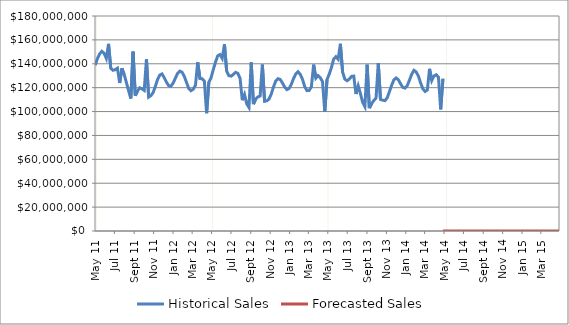
| Category | Week 1 of each Year |
|---|---|
| 2011-05-20 | 1 |
| 2011-05-27 | 0 |
| 2011-06-03 | 0 |
| 2011-06-10 | 0 |
| 2011-06-17 | 0 |
| 2011-06-24 | 0 |
| 2011-07-01 | 0 |
| 2011-07-08 | 0 |
| 2011-07-15 | 0 |
| 2011-07-22 | 0 |
| 2011-07-29 | 0 |
| 2011-08-05 | 0 |
| 2011-08-12 | 0 |
| 2011-08-19 | 0 |
| 2011-08-26 | 0 |
| 2011-09-02 | 0 |
| 2011-09-09 | 0 |
| 2011-09-16 | 0 |
| 2011-09-23 | 0 |
| 2011-09-30 | 0 |
| 2011-10-07 | 0 |
| 2011-10-14 | 0 |
| 2011-10-21 | 0 |
| 2011-10-28 | 0 |
| 2011-11-04 | 0 |
| 2011-11-11 | 0 |
| 2011-11-18 | 0 |
| 2011-11-25 | 0 |
| 2011-12-02 | 0 |
| 2011-12-09 | 0 |
| 2011-12-16 | 0 |
| 2011-12-23 | 0 |
| 2011-12-30 | 0 |
| 2012-01-06 | 0 |
| 2012-01-13 | 0 |
| 2012-01-20 | 0 |
| 2012-01-27 | 0 |
| 2012-02-03 | 0 |
| 2012-02-10 | 0 |
| 2012-02-17 | 0 |
| 2012-02-24 | 0 |
| 2012-03-02 | 0 |
| 2012-03-09 | 0 |
| 2012-03-16 | 0 |
| 2012-03-23 | 0 |
| 2012-03-30 | 0 |
| 2012-04-06 | 0 |
| 2012-04-13 | 0 |
| 2012-04-20 | 0 |
| 2012-04-27 | 0 |
| 2012-05-04 | 0 |
| 2012-05-11 | 0 |
| 2012-05-18 | 1 |
| 2012-05-25 | 0 |
| 2012-06-01 | 0 |
| 2012-06-08 | 0 |
| 2012-06-15 | 0 |
| 2012-06-22 | 0 |
| 2012-06-29 | 0 |
| 2012-07-06 | 0 |
| 2012-07-13 | 0 |
| 2012-07-20 | 0 |
| 2012-07-27 | 0 |
| 2012-08-03 | 0 |
| 2012-08-10 | 0 |
| 2012-08-17 | 0 |
| 2012-08-24 | 0 |
| 2012-08-31 | 0 |
| 2012-09-07 | 0 |
| 2012-09-14 | 0 |
| 2012-09-21 | 0 |
| 2012-09-28 | 0 |
| 2012-10-05 | 0 |
| 2012-10-12 | 0 |
| 2012-10-19 | 0 |
| 2012-10-26 | 0 |
| 2012-11-02 | 0 |
| 2012-11-09 | 0 |
| 2012-11-16 | 0 |
| 2012-11-23 | 0 |
| 2012-11-30 | 0 |
| 2012-12-07 | 0 |
| 2012-12-14 | 0 |
| 2012-12-21 | 0 |
| 2012-12-28 | 0 |
| 2013-01-04 | 0 |
| 2013-01-11 | 0 |
| 2013-01-18 | 0 |
| 2013-01-25 | 0 |
| 2013-02-01 | 0 |
| 2013-02-08 | 0 |
| 2013-02-15 | 0 |
| 2013-02-22 | 0 |
| 2013-03-01 | 0 |
| 2013-03-08 | 0 |
| 2013-03-15 | 0 |
| 2013-03-22 | 0 |
| 2013-03-29 | 0 |
| 2013-04-05 | 0 |
| 2013-04-12 | 0 |
| 2013-04-19 | 0 |
| 2013-04-26 | 0 |
| 2013-05-03 | 0 |
| 2013-05-10 | 0 |
| 2013-05-17 | 1 |
| 2013-05-24 | 0 |
| 2013-05-31 | 0 |
| 2013-06-07 | 0 |
| 2013-06-14 | 0 |
| 2013-06-21 | 0 |
| 2013-06-28 | 0 |
| 2013-07-05 | 0 |
| 2013-07-12 | 0 |
| 2013-07-19 | 0 |
| 2013-07-26 | 0 |
| 2013-08-02 | 0 |
| 2013-08-09 | 0 |
| 2013-08-16 | 0 |
| 2013-08-23 | 0 |
| 2013-08-30 | 0 |
| 2013-09-06 | 0 |
| 2013-09-13 | 0 |
| 2013-09-20 | 0 |
| 2013-09-27 | 0 |
| 2013-10-04 | 0 |
| 2013-10-11 | 0 |
| 2013-10-18 | 0 |
| 2013-10-25 | 0 |
| 2013-11-01 | 0 |
| 2013-11-08 | 0 |
| 2013-11-15 | 0 |
| 2013-11-22 | 0 |
| 2013-11-29 | 0 |
| 2013-12-06 | 0 |
| 2013-12-13 | 0 |
| 2013-12-20 | 0 |
| 2013-12-27 | 0 |
| 2014-01-03 | 0 |
| 2014-01-10 | 0 |
| 2014-01-17 | 0 |
| 2014-01-24 | 0 |
| 2014-01-31 | 0 |
| 2014-02-07 | 0 |
| 2014-02-14 | 0 |
| 2014-02-21 | 0 |
| 2014-02-28 | 0 |
| 2014-03-07 | 0 |
| 2014-03-14 | 0 |
| 2014-03-21 | 0 |
| 2014-03-28 | 0 |
| 2014-04-04 | 0 |
| 2014-04-11 | 0 |
| 2014-04-18 | 0 |
| 2014-04-25 | 0 |
| 2014-05-02 | 0 |
| 2014-05-09 | 0 |
| 2014-05-16 | 0 |
| 2014-05-23 | 1 |
| 2014-05-30 | 0 |
| 2014-06-06 | 0 |
| 2014-06-13 | 0 |
| 2014-06-20 | 0 |
| 2014-06-27 | 0 |
| 2014-07-04 | 0 |
| 2014-07-11 | 0 |
| 2014-07-18 | 0 |
| 2014-07-25 | 0 |
| 2014-08-01 | 0 |
| 2014-08-08 | 0 |
| 2014-08-15 | 0 |
| 2014-08-22 | 0 |
| 2014-08-29 | 0 |
| 2014-09-05 | 0 |
| 2014-09-12 | 0 |
| 2014-09-19 | 0 |
| 2014-09-26 | 0 |
| 2014-10-03 | 0 |
| 2014-10-10 | 0 |
| 2014-10-17 | 0 |
| 2014-10-24 | 0 |
| 2014-10-31 | 0 |
| 2014-11-07 | 0 |
| 2014-11-14 | 0 |
| 2014-11-21 | 0 |
| 2014-11-28 | 0 |
| 2014-12-05 | 0 |
| 2014-12-12 | 0 |
| 2014-12-19 | 0 |
| 2014-12-26 | 0 |
| 2015-01-02 | 0 |
| 2015-01-09 | 0 |
| 2015-01-16 | 0 |
| 2015-01-23 | 0 |
| 2015-01-30 | 0 |
| 2015-02-06 | 0 |
| 2015-02-13 | 0 |
| 2015-02-20 | 0 |
| 2015-02-27 | 0 |
| 2015-03-06 | 0 |
| 2015-03-13 | 0 |
| 2015-03-20 | 0 |
| 2015-03-27 | 0 |
| 2015-04-03 | 0 |
| 2015-04-10 | 0 |
| 2015-04-17 | 0 |
| 2015-04-24 | 0 |
| 2015-05-01 | 0 |
| 2015-05-08 | 0 |
| 2015-05-15 | 0 |